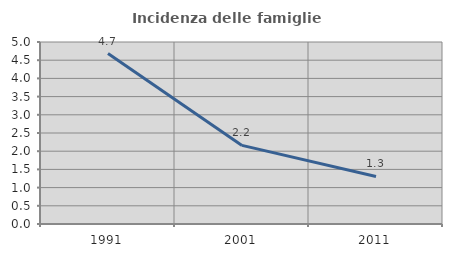
| Category | Incidenza delle famiglie numerose |
|---|---|
| 1991.0 | 4.682 |
| 2001.0 | 2.16 |
| 2011.0 | 1.307 |